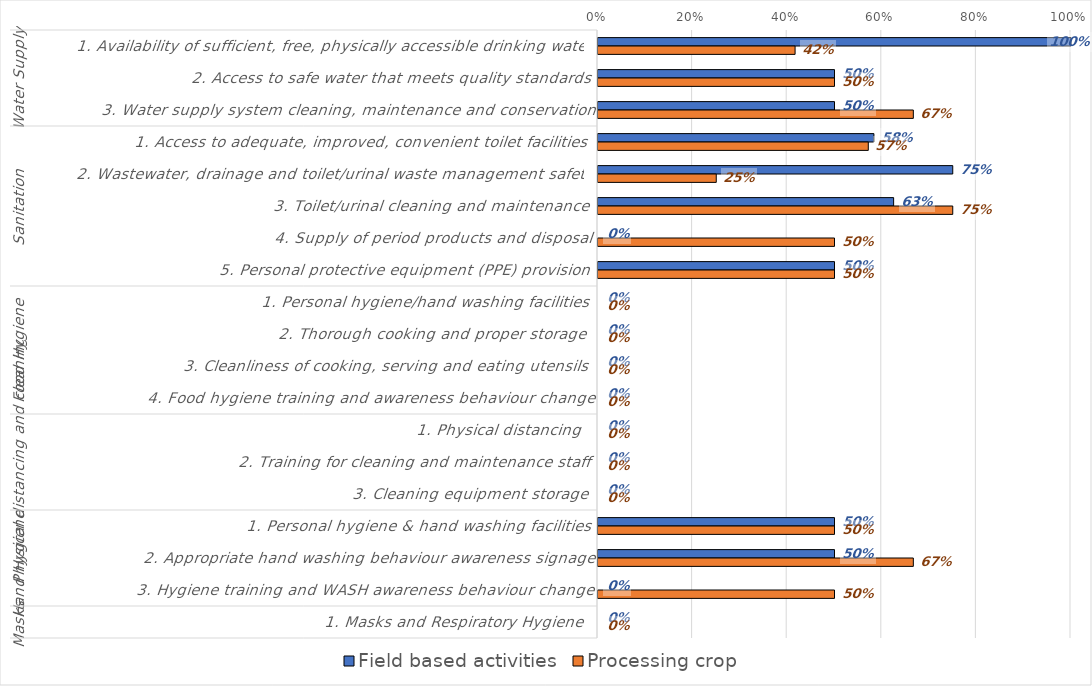
| Category | Field based activities  | Processing crop  |
|---|---|---|
| 0 | 1 | 0.417 |
| 1 | 0.5 | 0.5 |
| 2 | 0.5 | 0.667 |
| 3 | 0.583 | 0.571 |
| 4 | 0.75 | 0.25 |
| 5 | 0.625 | 0.75 |
| 6 | 0 | 0.5 |
| 7 | 0.5 | 0.5 |
| 8 | 0 | 0 |
| 9 | 0 | 0 |
| 10 | 0 | 0 |
| 11 | 0 | 0 |
| 12 | 0 | 0 |
| 13 | 0 | 0 |
| 14 | 0 | 0 |
| 15 | 0.5 | 0.5 |
| 16 | 0.5 | 0.667 |
| 17 | 0 | 0.5 |
| 18 | 0 | 0 |